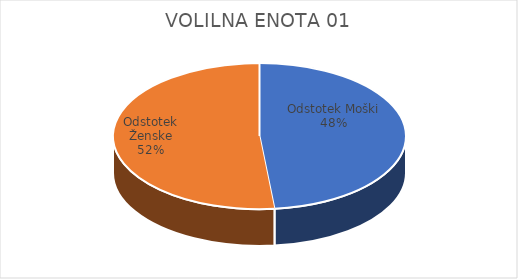
| Category | VOLILNA ENOTA 01 |
|---|---|
| Odstotek Moški | 26.53 |
| Odstotek Ženske | 28.31 |